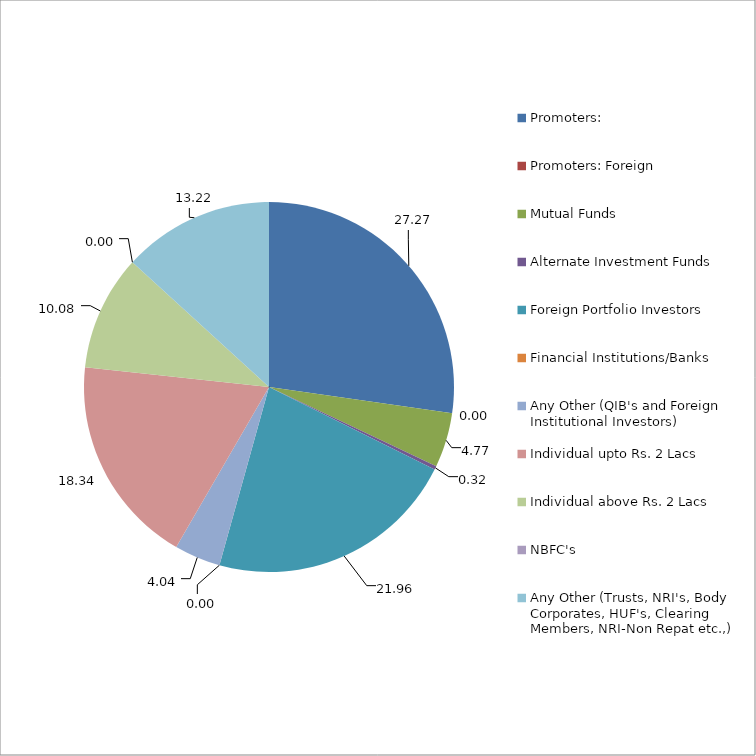
| Category | Series 0 |
|---|---|
| Promoters: | 27.27 |
| Promoters: Foreign | 0 |
| Mutual Funds | 4.77 |
| Alternate Investment Funds | 0.32 |
| Foreign Portfolio Investors | 21.96 |
| Financial Institutions/Banks | 0 |
| Any Other (QIB's and Foreign Institutional Investors) | 4.04 |
| Individual upto Rs. 2 Lacs | 18.34 |
| Individual above Rs. 2 Lacs | 10.08 |
| NBFC's | 0 |
| Any Other (Trusts, NRI's, Body Corporates, HUF's, Clearing Members, NRI-Non Repat etc.,) | 13.22 |